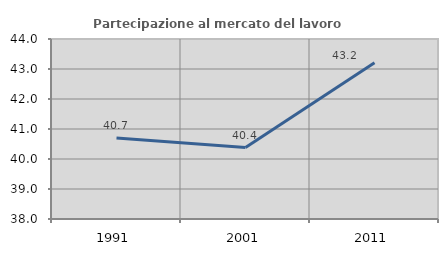
| Category | Partecipazione al mercato del lavoro  femminile |
|---|---|
| 1991.0 | 40.701 |
| 2001.0 | 40.379 |
| 2011.0 | 43.207 |